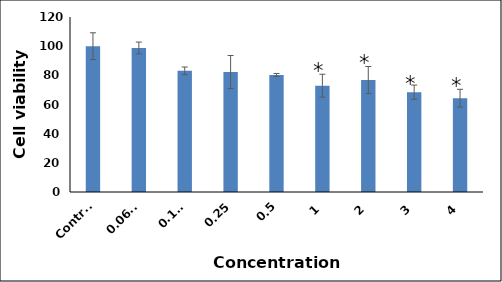
| Category | Series 0 |
|---|---|
| Control | 100 |
| 0.0625 | 98.757 |
| 0.125 | 83.081 |
| 0.25 | 82.268 |
| 0.5 | 80.267 |
| 1 | 72.901 |
| 2 | 76.771 |
| 3 | 68.471 |
| 4 | 64.358 |